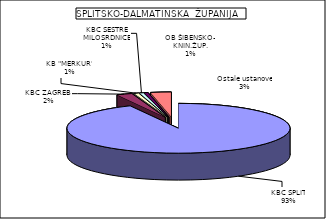
| Category | Series 0 |
|---|---|
| KBC SPLIT | 92.858 |
| KBC ZAGREB  | 2.286 |
| KB "MERKUR" | 0.711 |
| KBC SESTRE MILOSRDNICE | 0.582 |
| OB ŠIBENSKO– KNIN.ŽUP. | 0.552 |
| Ostale ustanove | 3.012 |